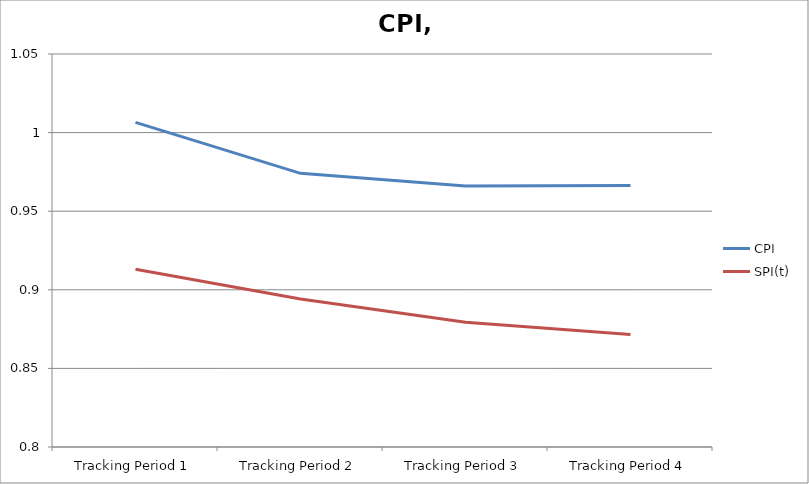
| Category | CPI | SPI(t) |
|---|---|---|
| Tracking Period 1 | 1.006 | 0.913 |
| Tracking Period 2 | 0.974 | 0.894 |
| Tracking Period 3 | 0.966 | 0.879 |
| Tracking Period 4 | 0.966 | 0.872 |